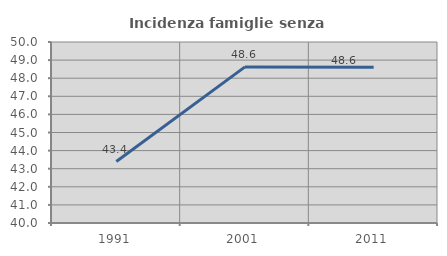
| Category | Incidenza famiglie senza nuclei |
|---|---|
| 1991.0 | 43.396 |
| 2001.0 | 48.624 |
| 2011.0 | 48.598 |